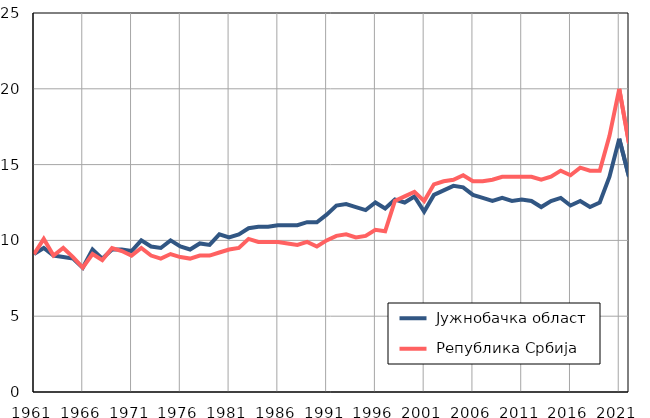
| Category |  Јужнобачка област |  Република Србија |
|---|---|---|
| 1961.0 | 9.1 | 9.1 |
| 1962.0 | 9.5 | 10.1 |
| 1963.0 | 9 | 9 |
| 1964.0 | 8.9 | 9.5 |
| 1965.0 | 8.8 | 8.9 |
| 1966.0 | 8.2 | 8.2 |
| 1967.0 | 9.4 | 9.1 |
| 1968.0 | 8.8 | 8.7 |
| 1969.0 | 9.4 | 9.5 |
| 1970.0 | 9.4 | 9.3 |
| 1971.0 | 9.3 | 9 |
| 1972.0 | 10 | 9.5 |
| 1973.0 | 9.6 | 9 |
| 1974.0 | 9.5 | 8.8 |
| 1975.0 | 10 | 9.1 |
| 1976.0 | 9.6 | 8.9 |
| 1977.0 | 9.4 | 8.8 |
| 1978.0 | 9.8 | 9 |
| 1979.0 | 9.7 | 9 |
| 1980.0 | 10.4 | 9.2 |
| 1981.0 | 10.2 | 9.4 |
| 1982.0 | 10.4 | 9.5 |
| 1983.0 | 10.8 | 10.1 |
| 1984.0 | 10.9 | 9.9 |
| 1985.0 | 10.9 | 9.9 |
| 1986.0 | 11 | 9.9 |
| 1987.0 | 11 | 9.8 |
| 1988.0 | 11 | 9.7 |
| 1989.0 | 11.2 | 9.9 |
| 1990.0 | 11.2 | 9.6 |
| 1991.0 | 11.7 | 10 |
| 1992.0 | 12.3 | 10.3 |
| 1993.0 | 12.4 | 10.4 |
| 1994.0 | 12.2 | 10.2 |
| 1995.0 | 12 | 10.3 |
| 1996.0 | 12.5 | 10.7 |
| 1997.0 | 12.1 | 10.6 |
| 1998.0 | 12.7 | 12.6 |
| 1999.0 | 12.5 | 12.9 |
| 2000.0 | 12.9 | 13.2 |
| 2001.0 | 11.9 | 12.6 |
| 2002.0 | 13 | 13.7 |
| 2003.0 | 13.3 | 13.9 |
| 2004.0 | 13.6 | 14 |
| 2005.0 | 13.5 | 14.3 |
| 2006.0 | 13 | 13.9 |
| 2007.0 | 12.8 | 13.9 |
| 2008.0 | 12.6 | 14 |
| 2009.0 | 12.8 | 14.2 |
| 2010.0 | 12.6 | 14.2 |
| 2011.0 | 12.7 | 14.2 |
| 2012.0 | 12.6 | 14.2 |
| 2013.0 | 12.2 | 14 |
| 2014.0 | 12.6 | 14.2 |
| 2015.0 | 12.8 | 14.6 |
| 2016.0 | 12.3 | 14.3 |
| 2017.0 | 12.6 | 14.8 |
| 2018.0 | 12.2 | 14.6 |
| 2019.0 | 12.5 | 14.6 |
| 2020.0 | 14.2 | 16.9 |
| 2021.0 | 16.7 | 20 |
| 2022.0 | 14.2 | 16.4 |